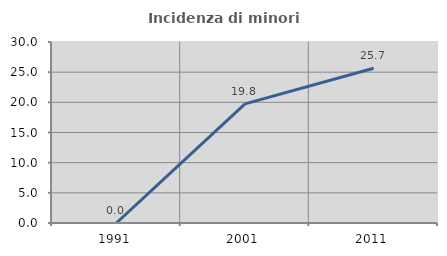
| Category | Incidenza di minori stranieri |
|---|---|
| 1991.0 | 0 |
| 2001.0 | 19.753 |
| 2011.0 | 25.66 |